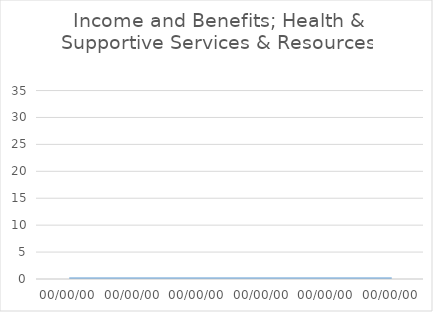
| Category | Income and Benefits; Health & Supportive Services & Resources |
|---|---|
| 00/00/00 | 0 |
| 00/00/00 | 0 |
| 00/00/00 | 0 |
| 00/00/00 | 0 |
| 00/00/00 | 0 |
| 00/00/00 | 0 |